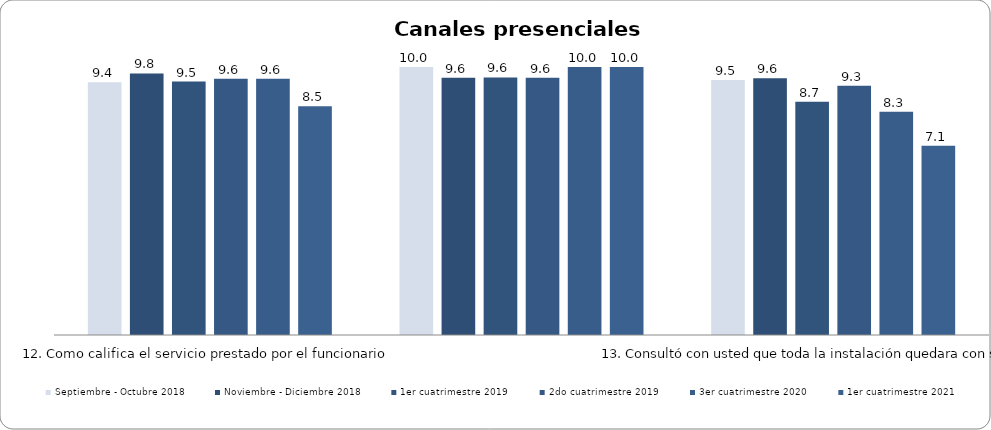
| Category | Septiembre - Octubre 2018 | Noviembre - Diciembre 2018 | 1er cuatrimestre 2019 | 2do cuatrimestre 2019 | 3er cuatrimestre 2020 | 1er cuatrimestre 2021 |
|---|---|---|---|---|---|---|
| 12. Como califica el servicio prestado por el funcionario | 9.432 | 9.76 | 9.455 | 9.566 | 9.566 | 8.535 |
| 13. Consultó con usted que toda la instalación quedara con servicio? | 10 | 9.6 | 9.61 | 9.6 | 10 | 10 |
| 14. Se dejó un volante de la reconexión | 9.512 | 9.583 | 8.701 | 9.296 | 8.333 | 7.059 |